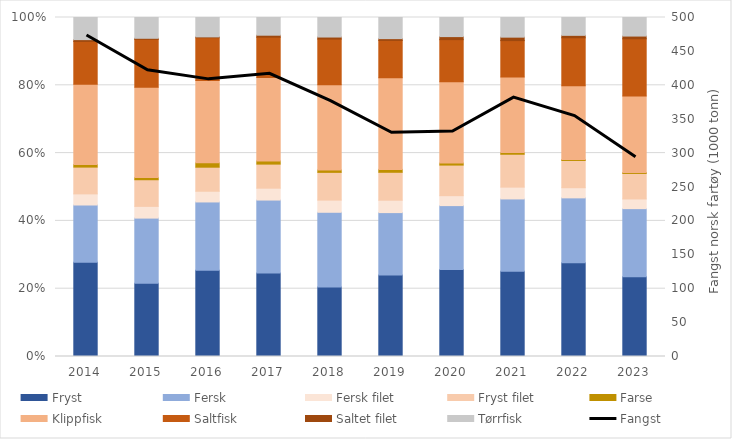
| Category | Fryst | Fersk | Fersk filet | Fryst filet | Farse | Klippfisk | Saltfisk | Saltet filet | Tørrfisk |
|---|---|---|---|---|---|---|---|---|---|
| 2014.0 | 144.873 | 88.271 | 17.127 | 41.211 | 4.061 | 123.557 | 65.795 | 2.751 | 34.062 |
| 2015.0 | 89.594 | 79.93 | 14.38 | 32.607 | 2.616 | 110.667 | 58.715 | 1.264 | 25.462 |
| 2016.0 | 109.126 | 86.537 | 13.563 | 30.44 | 5.51 | 104.204 | 54.243 | 1.006 | 24.556 |
| 2017.0 | 104.639 | 91.146 | 14.877 | 30.119 | 4.006 | 104.406 | 50.441 | 2.463 | 22.159 |
| 2018.0 | 79.573 | 85.824 | 13.972 | 31.815 | 2.74 | 97.702 | 52.431 | 2.323 | 22.407 |
| 2019.0 | 86.621 | 66.159 | 13.171 | 29.641 | 3.063 | 97.432 | 39.528 | 1.888 | 22.439 |
| 2020.0 | 86.773 | 63.867 | 9.925 | 30.531 | 2.02 | 81.139 | 42.051 | 3.047 | 19.074 |
| 2021.0 | 97.144 | 82.637 | 13.462 | 37.516 | 1.867 | 86.252 | 41.524 | 3.956 | 22.422 |
| 2022.0 | 100.375 | 69.508 | 10.878 | 29.17 | 0.955 | 79.063 | 51.365 | 2.615 | 19.111 |
| 2023.0 | 61.947 | 53.085 | 7.536 | 19.849 | 0.724 | 59.513 | 44.508 | 2.116 | 14.451 |